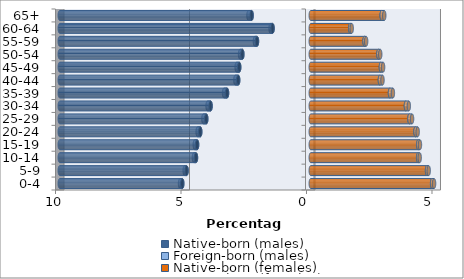
| Category | Native-born (males) | Foreign-born (males) | Native-born (females) | Foreign-born (females) |
|---|---|---|---|---|
| 0-4 | -5.119 | -0.089 | 4.834 | 0.08 |
| 5-9 | -4.947 | -0.077 | 4.633 | 0.066 |
| 10-14 | -4.572 | -0.082 | 4.278 | 0.062 |
| 15-19 | -4.528 | -0.092 | 4.281 | 0.07 |
| 20-24 | -4.402 | -0.105 | 4.174 | 0.086 |
| 25-29 | -4.163 | -0.115 | 3.931 | 0.106 |
| 30-34 | -3.991 | -0.12 | 3.792 | 0.116 |
| 35-39 | -3.335 | -0.119 | 3.157 | 0.116 |
| 40-44 | -2.891 | -0.112 | 2.755 | 0.104 |
| 45-49 | -2.85 | -0.103 | 2.795 | 0.088 |
| 50-54 | -2.725 | -0.091 | 2.695 | 0.074 |
| 55-59 | -2.142 | -0.084 | 2.142 | 0.066 |
| 60-64 | -1.521 | -0.08 | 1.574 | 0.059 |
| 65+ | -2.356 | -0.126 | 2.826 | 0.102 |